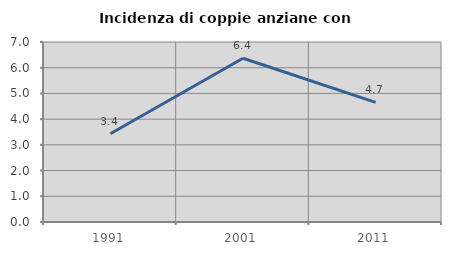
| Category | Incidenza di coppie anziane con figli |
|---|---|
| 1991.0 | 3.431 |
| 2001.0 | 6.369 |
| 2011.0 | 4.651 |